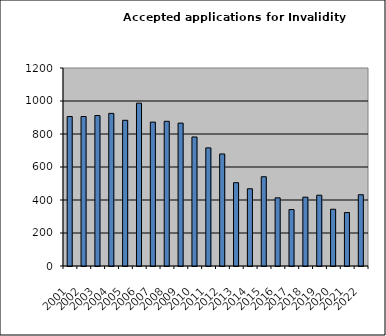
| Category | Series 1 |
|---|---|
| 2001.0 | 906 |
| 2002.0 | 906 |
| 2003.0 | 912 |
| 2004.0 | 925 |
| 2005.0 | 883 |
| 2006.0 | 987 |
| 2007.0 | 872 |
| 2008.0 | 877 |
| 2009.0 | 866 |
| 2010.0 | 782 |
| 2011.0 | 716 |
| 2012.0 | 679 |
| 2013.0 | 505 |
| 2014.0 | 468 |
| 2015.0 | 541 |
| 2016.0 | 413 |
| 2017.0 | 342 |
| 2018.0 | 417 |
| 2019.0 | 429 |
| 2020.0 | 344 |
| 2021.0 | 324 |
| 2022.0 | 432 |